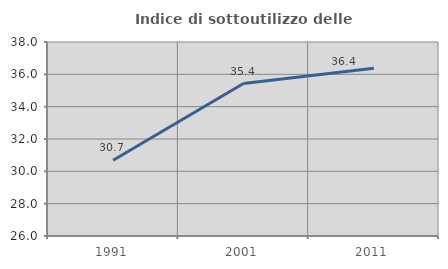
| Category | Indice di sottoutilizzo delle abitazioni  |
|---|---|
| 1991.0 | 30.682 |
| 2001.0 | 35.431 |
| 2011.0 | 36.38 |